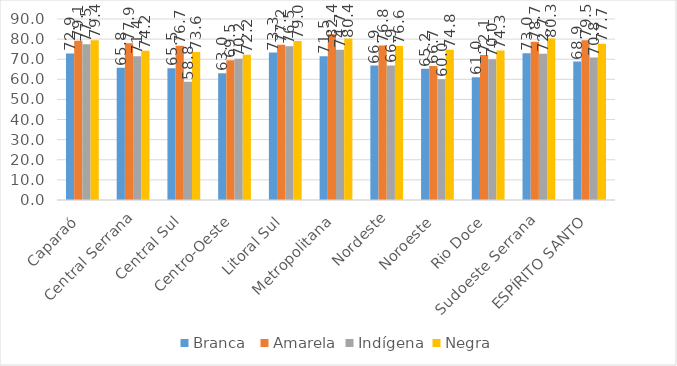
| Category | Branca  | Amarela | Indígena | Negra |
|---|---|---|---|---|
| Caparaó | 72.893 | 79.149 | 77.5 | 79.373 |
| Central Serrana | 65.798 | 77.922 | 71.429 | 74.225 |
| Central Sul | 65.493 | 76.739 | 58.824 | 73.643 |
| Centro-Oeste | 63.014 | 69.466 | 70.175 | 72.232 |
| Litoral Sul | 73.341 | 77.188 | 76.471 | 79.03 |
| Metropolitana | 71.48 | 82.419 | 74.704 | 80.36 |
| Nordeste | 66.866 | 76.837 | 66.912 | 76.625 |
| Noroeste | 65.223 | 66.667 | 60 | 74.751 |
| Rio Doce | 60.986 | 72.146 | 70.04 | 74.299 |
| Sudoeste Serrana | 72.972 | 78.667 | 72.727 | 80.309 |
| ESPÍRITO SANTO | 68.854 | 79.451 | 70.824 | 77.71 |